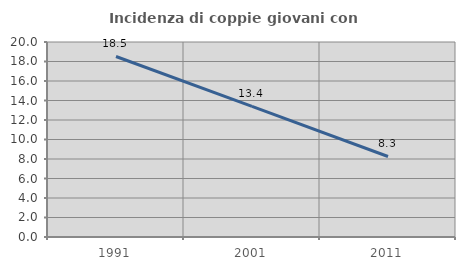
| Category | Incidenza di coppie giovani con figli |
|---|---|
| 1991.0 | 18.516 |
| 2001.0 | 13.406 |
| 2011.0 | 8.257 |